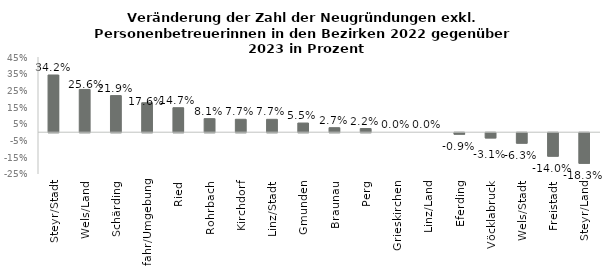
| Category | Series 1 |
|---|---|
| Steyr/Stadt | 0.342 |
| Wels/Land | 0.256 |
| Schärding | 0.219 |
| Urfahr/Umgebung | 0.176 |
| Ried | 0.147 |
| Rohrbach | 0.081 |
| Kirchdorf | 0.077 |
| Linz/Stadt | 0.077 |
| Gmunden | 0.055 |
| Braunau | 0.027 |
| Perg | 0.022 |
| Grieskirchen | 0 |
| Linz/Land | 0 |
| Eferding | -0.009 |
| Vöcklabruck | -0.031 |
| Wels/Stadt | -0.062 |
| Freistadt | -0.14 |
| Steyr/Land | -0.183 |